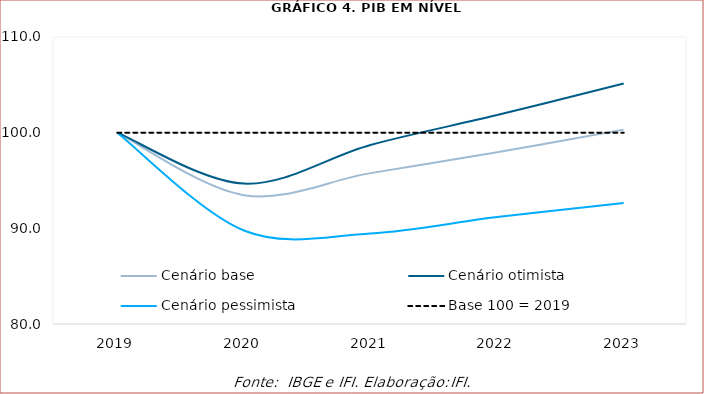
| Category | Cenário base | Cenário otimista | Cenário pessimista | Base 100 = 2019 |
|---|---|---|---|---|
| 2019.0 | 100 | 100 | 100 | 100 |
| 2020.0 | 93.468 | 94.679 | 89.778 | 100 |
| 2021.0 | 95.771 | 98.717 | 89.47 | 100 |
| 2022.0 | 97.945 | 101.839 | 91.18 | 100 |
| 2023.0 | 100.317 | 105.137 | 92.648 | 100 |